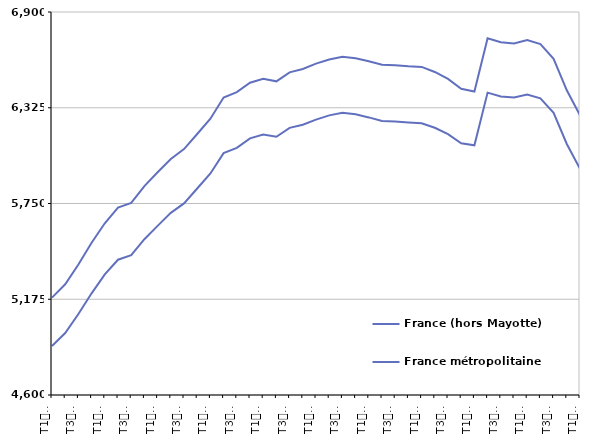
| Category | France (hors Mayotte) | France métropolitaine |
|---|---|---|
| T1
2012 | 5184.9 | 4894.8 |
| T2
2012 | 5265.1 | 4971.9 |
| T3
2012 | 5383.5 | 5086.2 |
| T4
2012 | 5513.9 | 5210.6 |
| T1
2013 | 5631.5 | 5323.9 |
| T2
2013 | 5725.2 | 5412.3 |
| T3
2013 | 5753.5 | 5439.5 |
| T4
2013 | 5854.6 | 5535.4 |
| T1
2014 | 5937.7 | 5615.8 |
| T2
2014 | 6017.3 | 5693.6 |
| T3
2014 | 6076.5 | 5750.7 |
| T4
2014 | 6167.4 | 5840.1 |
| T1
2015 | 6259.5 | 5930.2 |
| T2
2015 | 6386 | 6052.5 |
| T3
2015 | 6418.5 | 6084.3 |
| T4
2015 | 6475.4 | 6141.2 |
| T1
2016 | 6499.1 | 6163.7 |
| T2
2016 | 6483.7 | 6151.1 |
| T3
2016 | 6537.5 | 6204.4 |
| T4
2016 | 6558.1 | 6223.4 |
| T1
2017 | 6589.9 | 6253.8 |
| T2
2017 | 6614.8 | 6279.3 |
| T3
2017 | 6631.2 | 6295.5 |
| T4
2017 | 6622.4 | 6285.6 |
| T1
2018 | 6604.3 | 6267 |
| T2
2018 | 6583.4 | 6245 |
| T3
2018 | 6579.5 | 6242.2 |
| T4
2018 | 6573.8 | 6236.2 |
| T1
2019 | 6570.1 | 6231.9 |
| T2
2019 | 6539.9 | 6204.7 |
| T3
2019 | 6498.5 | 6166.2 |
| T4
2019 | 6439.1 | 6112 |
| T1
2020 | 6422.7 | 6099.3 |
| T2
2020 | 6741.9 | 6415.8 |
| T3
2020 | 6718.8 | 6392.4 |
| T4
2020 | 6711.5 | 6386.7 |
| T1
2021 | 6731.2 | 6405 |
| T2
2021 | 6706.9 | 6381.7 |
| T3
2021 | 6618.3 | 6294.5 |
| T4
2021 | 6429.8 | 6107.4 |
| T1
2022 | 6279.3 | 5959 |